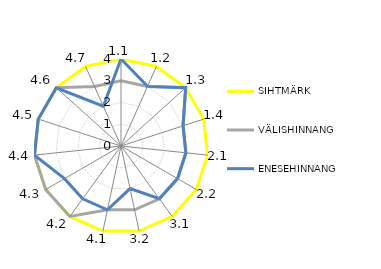
| Category | SIHTMÄRK | VÄLISHINNANG | ENESEHINNANG |
|---|---|---|---|
| 1.1 | 4 | 3 | 4 |
| 1.2 | 4 | 3 | 3 |
| 1.3 | 4 | 4 | 4 |
| 1.4 | 4 | 3 | 3 |
| 2.1 | 4 | 3 | 3 |
| 2.2 | 4 | 3 | 3 |
| 3.1 | 4 | 3 | 3 |
| 3.2 | 4 | 3 | 2 |
| 4.1 | 4 | 3 | 3 |
| 4.2 | 4 | 4 | 3 |
| 4.3 | 4 | 4 | 3 |
| 4.4 | 4 | 4 | 4 |
| 4.5 | 4 | 4 | 4 |
| 4.6 | 4 | 4 | 4 |
| 4.7 | 4 | 3 | 2 |